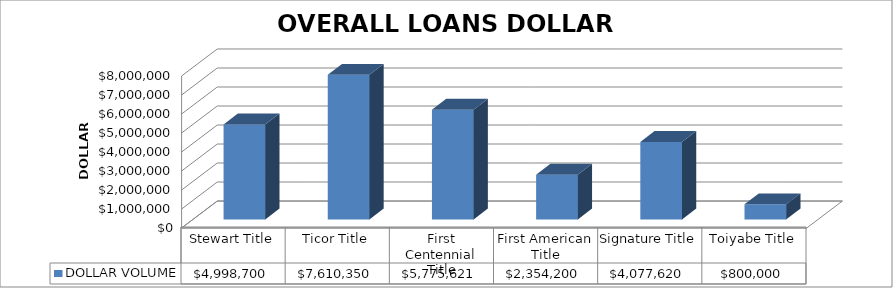
| Category | DOLLAR VOLUME |
|---|---|
| Stewart Title | 4998700 |
| Ticor Title | 7610350 |
| First Centennial Title | 5775621 |
| First American Title | 2354200 |
| Signature Title | 4077620 |
| Toiyabe Title | 800000 |